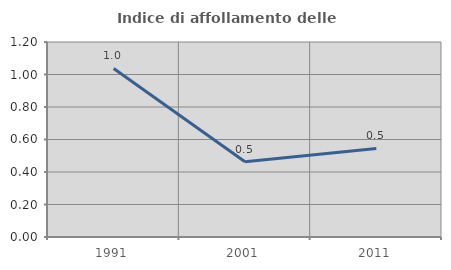
| Category | Indice di affollamento delle abitazioni  |
|---|---|
| 1991.0 | 1.037 |
| 2001.0 | 0.463 |
| 2011.0 | 0.545 |